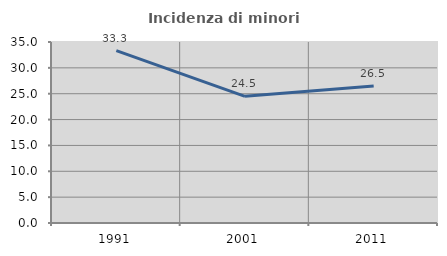
| Category | Incidenza di minori stranieri |
|---|---|
| 1991.0 | 33.333 |
| 2001.0 | 24.49 |
| 2011.0 | 26.496 |